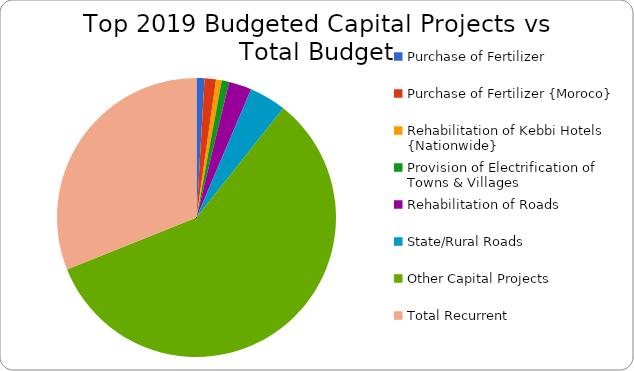
| Category | Series 0 |
|---|---|
| Purchase of Fertilizer | 1400000000 |
| Purchase of Fertilizer {Moroco} | 2000000000 |
| Rehabilitation of Kebbi Hotels {Nationwide} | 1000000000 |
| Provision of Electrification of Towns & Villages | 1300000000 |
| Rehabilitation of Roads | 4000000000 |
| State/Rural Roads | 6500000000 |
| Other Capital Projects | 88185049818 |
| Total Recurrent  | 47077186420 |